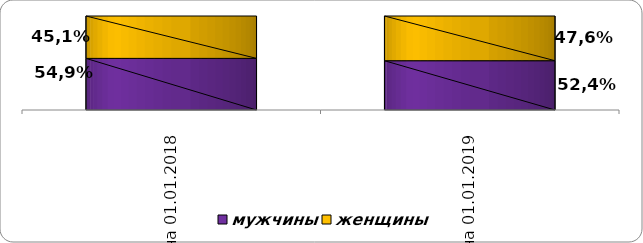
| Category | мужчины | женщины |
|---|---|---|
| на 01.01.2018  | 0.549 | 0.451 |
| на 01.01.2019  | 0.524 | 0.476 |